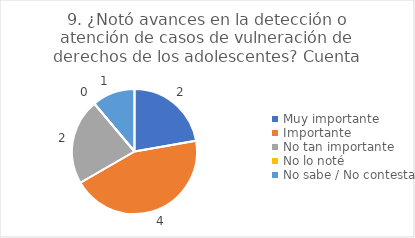
| Category | 9. ¿Notó avances en la detección o atención de casos de vulneración de derechos de los adolescentes? |
|---|---|
| Muy importante  | 0.222 |
| Importante  | 0.444 |
| No tan importante  | 0.222 |
| No lo noté  | 0 |
| No sabe / No contesta | 0.111 |